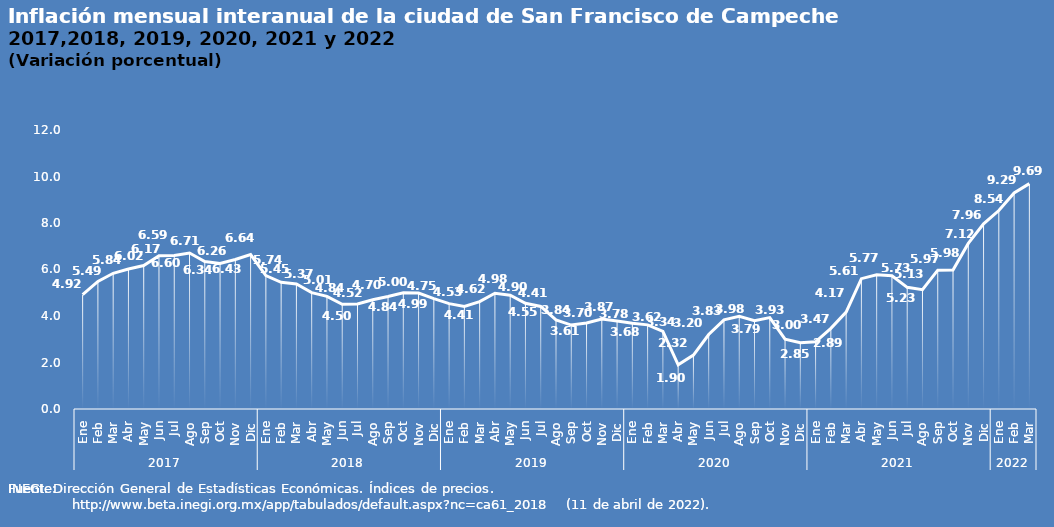
| Category | Inflación mensual interanual |
|---|---|
| 0 | 4.919 |
| 1 | 5.489 |
| 2 | 5.837 |
| 3 | 6.023 |
| 4 | 6.171 |
| 5 | 6.589 |
| 6 | 6.603 |
| 7 | 6.708 |
| 8 | 6.341 |
| 9 | 6.256 |
| 10 | 6.431 |
| 11 | 6.642 |
| 12 | 5.739 |
| 13 | 5.452 |
| 14 | 5.375 |
| 15 | 5.006 |
| 16 | 4.844 |
| 17 | 4.501 |
| 18 | 4.521 |
| 19 | 4.699 |
| 20 | 4.839 |
| 21 | 4.996 |
| 22 | 4.989 |
| 23 | 4.751 |
| 24 | 4.533 |
| 25 | 4.413 |
| 26 | 4.621 |
| 27 | 4.977 |
| 28 | 4.897 |
| 29 | 4.547 |
| 30 | 4.41 |
| 31 | 3.835 |
| 32 | 3.611 |
| 33 | 3.697 |
| 34 | 3.871 |
| 35 | 3.783 |
| 36 | 3.685 |
| 37 | 3.618 |
| 38 | 3.341 |
| 39 | 1.9 |
| 40 | 2.32 |
| 41 | 3.204 |
| 42 | 3.835 |
| 43 | 3.984 |
| 44 | 3.794 |
| 45 | 3.933 |
| 46 | 3.001 |
| 47 | 2.846 |
| 48 | 2.89 |
| 49 | 3.467 |
| 50 | 4.17 |
| 51 | 5.606 |
| 52 | 5.769 |
| 53 | 5.732 |
| 54 | 5.232 |
| 55 | 5.13 |
| 56 | 5.97 |
| 57 | 5.976 |
| 58 | 7.121 |
| 59 | 7.963 |
| 60 | 8.537 |
| 61 | 9.292 |
| 62 | 9.693 |